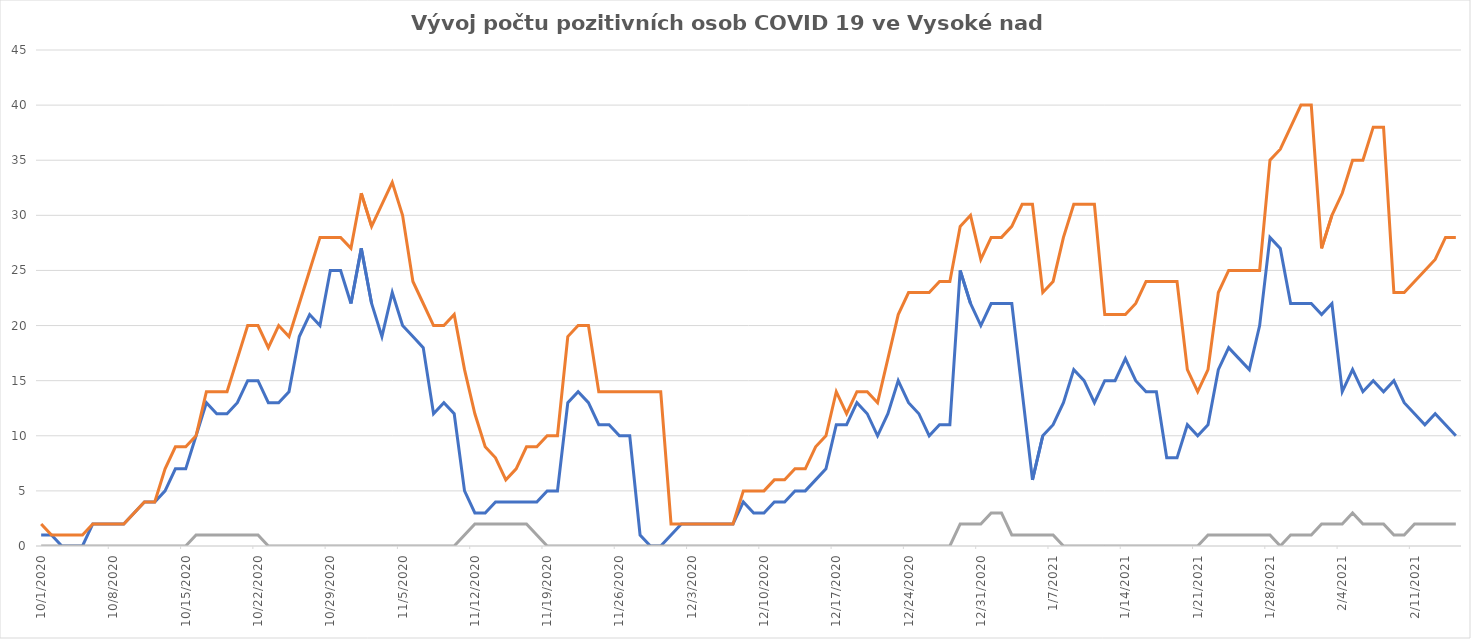
| Category | Series 0 | Series 1 | Series 2 |
|---|---|---|---|
| 10/1/20 | 1 | 2 | 0 |
| 10/2/20 | 1 | 1 | 0 |
| 10/3/20 | 0 | 1 | 0 |
| 10/4/20 | 0 | 1 | 0 |
| 10/5/20 | 0 | 1 | 0 |
| 10/6/20 | 2 | 2 | 0 |
| 10/7/20 | 2 | 2 | 0 |
| 10/8/20 | 2 | 2 | 0 |
| 10/9/20 | 2 | 2 | 0 |
| 10/10/20 | 3 | 3 | 0 |
| 10/11/20 | 4 | 4 | 0 |
| 10/12/20 | 4 | 4 | 0 |
| 10/13/20 | 5 | 7 | 0 |
| 10/14/20 | 7 | 9 | 0 |
| 10/15/20 | 7 | 9 | 0 |
| 10/16/20 | 10 | 10 | 1 |
| 10/17/20 | 13 | 14 | 1 |
| 10/18/20 | 12 | 14 | 1 |
| 10/19/20 | 12 | 14 | 1 |
| 10/20/20 | 13 | 17 | 1 |
| 10/21/20 | 15 | 20 | 1 |
| 10/22/20 | 15 | 20 | 1 |
| 10/23/20 | 13 | 18 | 0 |
| 10/24/20 | 13 | 20 | 0 |
| 10/25/20 | 14 | 19 | 0 |
| 10/26/20 | 19 | 22 | 0 |
| 10/27/20 | 21 | 25 | 0 |
| 10/28/20 | 20 | 28 | 0 |
| 10/29/20 | 25 | 28 | 0 |
| 10/30/20 | 25 | 28 | 0 |
| 10/31/20 | 22 | 27 | 0 |
| 11/1/20 | 27 | 32 | 0 |
| 11/2/20 | 22 | 29 | 0 |
| 11/3/20 | 19 | 31 | 0 |
| 11/4/20 | 23 | 33 | 0 |
| 11/5/20 | 20 | 30 | 0 |
| 11/6/20 | 19 | 24 | 0 |
| 11/7/20 | 18 | 22 | 0 |
| 11/8/20 | 12 | 20 | 0 |
| 11/9/20 | 13 | 20 | 0 |
| 11/10/20 | 12 | 21 | 0 |
| 11/11/20 | 5 | 16 | 1 |
| 11/12/20 | 3 | 12 | 2 |
| 11/13/20 | 3 | 9 | 2 |
| 11/14/20 | 4 | 8 | 2 |
| 11/15/20 | 4 | 6 | 2 |
| 11/16/20 | 4 | 7 | 2 |
| 11/17/20 | 4 | 9 | 2 |
| 11/18/20 | 4 | 9 | 1 |
| 11/19/20 | 5 | 10 | 0 |
| 11/20/20 | 5 | 10 | 0 |
| 11/21/20 | 13 | 19 | 0 |
| 11/22/20 | 14 | 20 | 0 |
| 11/23/20 | 13 | 20 | 0 |
| 11/24/20 | 11 | 14 | 0 |
| 11/25/20 | 11 | 14 | 0 |
| 11/26/20 | 10 | 14 | 0 |
| 11/27/20 | 10 | 14 | 0 |
| 11/28/20 | 1 | 14 | 0 |
| 11/29/20 | 0 | 14 | 0 |
| 11/30/20 | 0 | 14 | 0 |
| 12/1/20 | 1 | 2 | 0 |
| 12/2/20 | 2 | 2 | 0 |
| 12/3/20 | 2 | 2 | 0 |
| 12/4/20 | 2 | 2 | 0 |
| 12/5/20 | 2 | 2 | 0 |
| 12/6/20 | 2 | 2 | 0 |
| 12/7/20 | 2 | 2 | 0 |
| 12/8/20 | 4 | 5 | 0 |
| 12/9/20 | 3 | 5 | 0 |
| 12/10/20 | 3 | 5 | 0 |
| 12/11/20 | 4 | 6 | 0 |
| 12/12/20 | 4 | 6 | 0 |
| 12/13/20 | 5 | 7 | 0 |
| 12/14/20 | 5 | 7 | 0 |
| 12/15/20 | 6 | 9 | 0 |
| 12/16/20 | 7 | 10 | 0 |
| 12/17/20 | 11 | 14 | 0 |
| 12/18/20 | 11 | 12 | 0 |
| 12/19/20 | 13 | 14 | 0 |
| 12/20/20 | 12 | 14 | 0 |
| 12/21/20 | 10 | 13 | 0 |
| 12/22/20 | 12 | 17 | 0 |
| 12/23/20 | 15 | 21 | 0 |
| 12/24/20 | 13 | 23 | 0 |
| 12/25/20 | 12 | 23 | 0 |
| 12/26/20 | 10 | 23 | 0 |
| 12/27/20 | 11 | 24 | 0 |
| 12/28/20 | 11 | 24 | 0 |
| 12/29/20 | 25 | 29 | 2 |
| 12/30/20 | 22 | 30 | 2 |
| 12/31/20 | 20 | 26 | 2 |
| 1/1/21 | 22 | 28 | 3 |
| 1/2/21 | 22 | 28 | 3 |
| 1/3/21 | 22 | 29 | 1 |
| 1/4/21 | 14 | 31 | 1 |
| 1/5/21 | 6 | 31 | 1 |
| 1/6/21 | 10 | 23 | 1 |
| 1/7/21 | 11 | 24 | 1 |
| 1/8/21 | 13 | 28 | 0 |
| 1/9/21 | 16 | 31 | 0 |
| 1/10/21 | 15 | 31 | 0 |
| 1/11/21 | 13 | 31 | 0 |
| 1/12/21 | 15 | 21 | 0 |
| 1/13/21 | 15 | 21 | 0 |
| 1/14/21 | 17 | 21 | 0 |
| 1/15/21 | 15 | 22 | 0 |
| 1/16/21 | 14 | 24 | 0 |
| 1/17/21 | 14 | 24 | 0 |
| 1/18/21 | 8 | 24 | 0 |
| 1/19/21 | 8 | 24 | 0 |
| 1/20/21 | 11 | 16 | 0 |
| 1/21/21 | 10 | 14 | 0 |
| 1/22/21 | 11 | 16 | 1 |
| 1/23/21 | 16 | 23 | 1 |
| 1/24/21 | 18 | 25 | 1 |
| 1/25/21 | 17 | 25 | 1 |
| 1/26/21 | 16 | 25 | 1 |
| 1/27/21 | 20 | 25 | 1 |
| 1/28/21 | 28 | 35 | 1 |
| 1/29/21 | 27 | 36 | 0 |
| 1/30/21 | 22 | 38 | 1 |
| 1/31/21 | 22 | 40 | 1 |
| 2/1/21 | 22 | 40 | 1 |
| 2/2/21 | 21 | 27 | 2 |
| 2/3/21 | 22 | 30 | 2 |
| 2/4/21 | 14 | 32 | 2 |
| 2/5/21 | 16 | 35 | 3 |
| 2/6/21 | 14 | 35 | 2 |
| 2/7/21 | 15 | 38 | 2 |
| 2/8/21 | 14 | 38 | 2 |
| 2/9/21 | 15 | 23 | 1 |
| 2/10/21 | 13 | 23 | 1 |
| 2/11/21 | 12 | 24 | 2 |
| 2/12/21 | 11 | 25 | 2 |
| 2/13/21 | 12 | 26 | 2 |
| 2/14/21 | 11 | 28 | 2 |
| 2/15/21 | 10 | 28 | 2 |